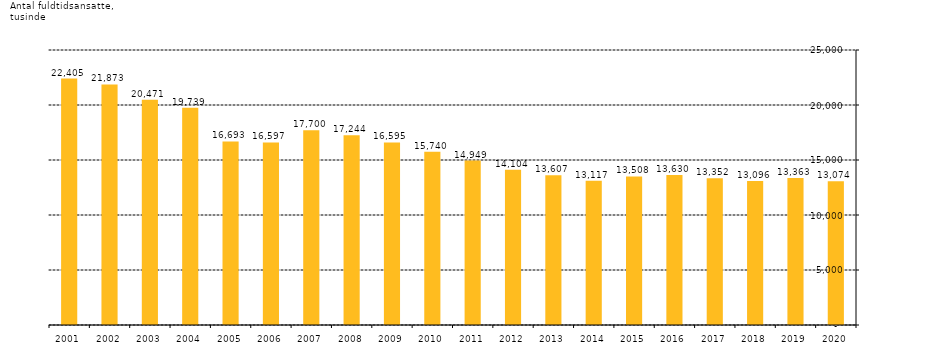
| Category | Series 0 |
|---|---|
| 2020.0 | 13074.03 |
| 2019.0 | 13363.3 |
| 2018.0 | 13096.048 |
| 2017.0 | 13352 |
| 2016.0 | 13630 |
| 2015.0 | 13508 |
| 2014.0 | 13117 |
| 2013.0 | 13607 |
| 2012.0 | 14104 |
| 2011.0 | 14949 |
| 2010.0 | 15740 |
| 2009.0 | 16595 |
| 2008.0 | 17244 |
| 2007.0 | 17700 |
| 2006.0 | 16597 |
| 2005.0 | 16693 |
| 2004.0 | 19739 |
| 2003.0 | 20471 |
| 2002.0 | 21873 |
| 2001.0 | 22405 |